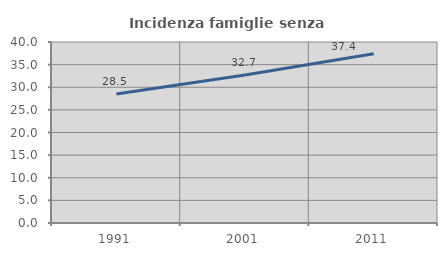
| Category | Incidenza famiglie senza nuclei |
|---|---|
| 1991.0 | 28.484 |
| 2001.0 | 32.69 |
| 2011.0 | 37.403 |